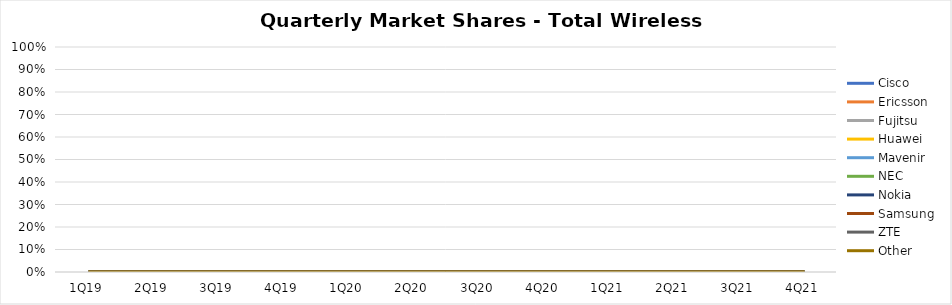
| Category | Cisco | Ericsson | Fujitsu | Huawei | Mavenir | NEC | Nokia | Samsung | ZTE | Other |
|---|---|---|---|---|---|---|---|---|---|---|
| 1Q19 | 0 | 0 | 0 | 0 | 0 | 0 | 0 | 0 | 0 | 0 |
| 2Q19 | 0 | 0 | 0 | 0 | 0 | 0 | 0 | 0 | 0 | 0 |
| 3Q19 | 0 | 0 | 0 | 0 | 0 | 0 | 0 | 0 | 0 | 0 |
| 4Q19 | 0 | 0 | 0 | 0 | 0 | 0 | 0 | 0 | 0 | 0 |
| 1Q20 | 0 | 0 | 0 | 0 | 0 | 0 | 0 | 0 | 0 | 0 |
| 2Q20 | 0 | 0 | 0 | 0 | 0 | 0 | 0 | 0 | 0 | 0 |
| 3Q20 | 0 | 0 | 0 | 0 | 0 | 0 | 0 | 0 | 0 | 0 |
| 4Q20 | 0 | 0 | 0 | 0 | 0 | 0 | 0 | 0 | 0 | 0 |
| 1Q21 | 0 | 0 | 0 | 0 | 0 | 0 | 0 | 0 | 0 | 0 |
| 2Q21 | 0 | 0 | 0 | 0 | 0 | 0 | 0 | 0 | 0 | 0 |
| 3Q21 | 0 | 0 | 0 | 0 | 0 | 0 | 0 | 0 | 0 | 0 |
| 4Q21 | 0 | 0 | 0 | 0 | 0 | 0 | 0 | 0 | 0 | 0 |